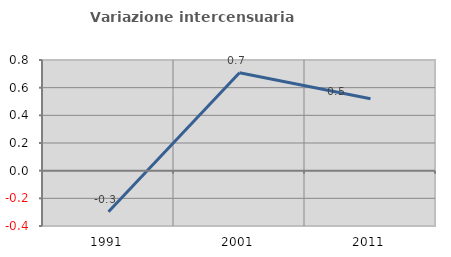
| Category | Variazione intercensuaria annua |
|---|---|
| 1991.0 | -0.297 |
| 2001.0 | 0.707 |
| 2011.0 | 0.52 |